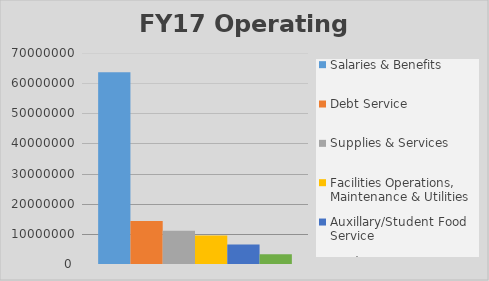
| Category | Salaries & Benefits | Debt Service | Supplies & Services | Facilities Operations, Maintenance & Utilities | Auxillary/Student Food Service | Student Aid/Waivers/Entitlements |
|---|---|---|---|---|---|---|
| 0 | 63621687 | 14269526 | 11010342 | 9455873 | 6480000 | 3275895 |